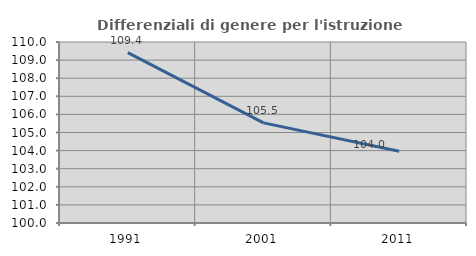
| Category | Differenziali di genere per l'istruzione superiore |
|---|---|
| 1991.0 | 109.414 |
| 2001.0 | 105.531 |
| 2011.0 | 103.968 |